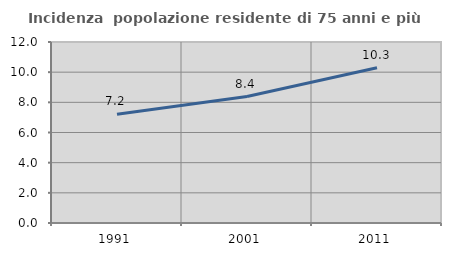
| Category | Incidenza  popolazione residente di 75 anni e più |
|---|---|
| 1991.0 | 7.205 |
| 2001.0 | 8.384 |
| 2011.0 | 10.298 |